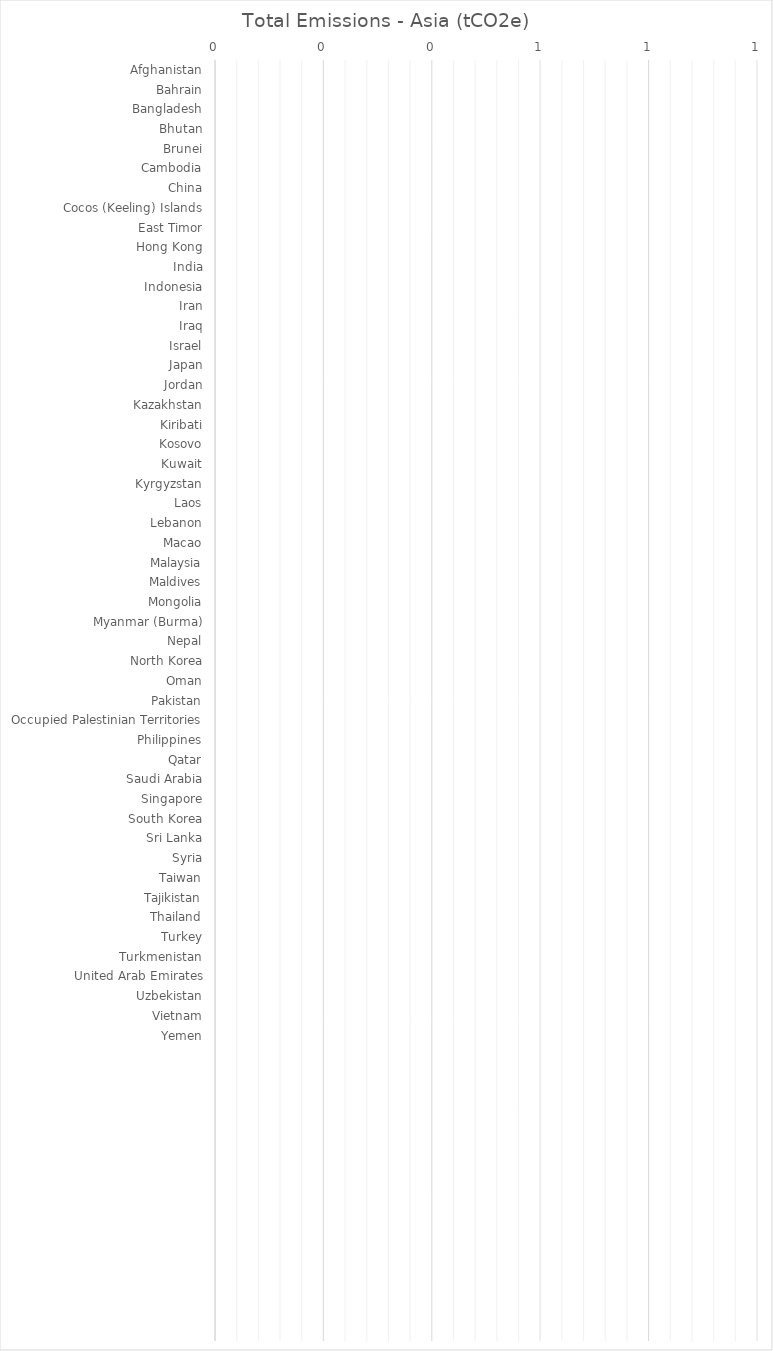
| Category | Total Emissions - Asia (tCO2e) |
|---|---|
| Afghanistan | 0 |
| Bahrain | 0 |
| Bangladesh | 0 |
| Bhutan | 0 |
| Brunei | 0 |
| Cambodia | 0 |
| China | 0 |
| Cocos (Keeling) Islands | 0 |
| East Timor | 0 |
| Hong Kong | 0 |
| India | 0 |
| Indonesia | 0 |
| Iran | 0 |
| Iraq | 0 |
| Israel | 0 |
| Japan | 0 |
| Jordan | 0 |
| Kazakhstan | 0 |
| Kiribati | 0 |
| Kosovo | 0 |
| Kuwait | 0 |
| Kyrgyzstan | 0 |
| Laos | 0 |
| Lebanon | 0 |
| Macao | 0 |
| Malaysia | 0 |
| Maldives | 0 |
| Mongolia | 0 |
| Myanmar (Burma) | 0 |
| Nepal | 0 |
| North Korea | 0 |
| Oman | 0 |
| Pakistan | 0 |
| Occupied Palestinian Territories | 0 |
| Philippines | 0 |
| Qatar | 0 |
| Saudi Arabia | 0 |
| Singapore | 0 |
| South Korea | 0 |
| Sri Lanka | 0 |
| Syria | 0 |
| Taiwan | 0 |
| Tajikistan | 0 |
| Thailand | 0 |
| Turkey | 0 |
| Turkmenistan | 0 |
| United Arab Emirates | 0 |
| Uzbekistan | 0 |
| Vietnam | 0 |
| Yemen | 0 |